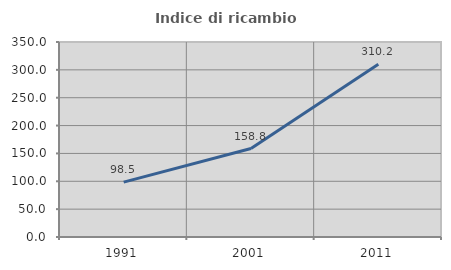
| Category | Indice di ricambio occupazionale  |
|---|---|
| 1991.0 | 98.465 |
| 2001.0 | 158.784 |
| 2011.0 | 310.191 |